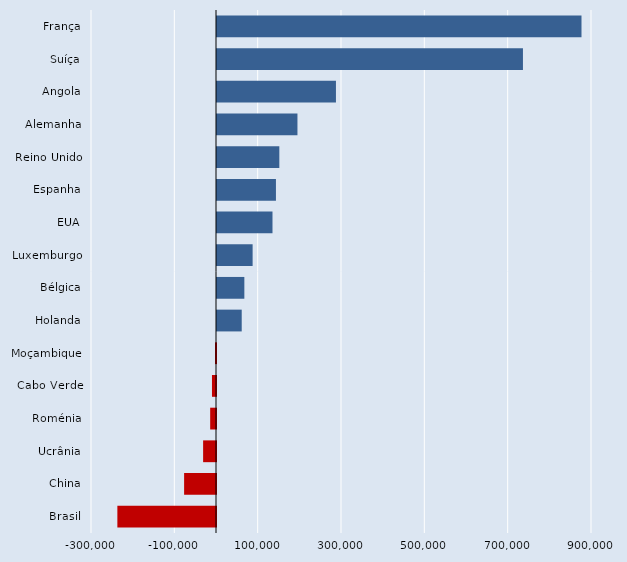
| Category | Series 0 |
|---|---|
| França | 874787 |
| Suíça | 734282 |
| Angola | 285481 |
| Alemanha | 193084 |
| Reino Unido | 149592 |
| Espanha | 141460 |
| EUA | 133181 |
| Luxemburgo | 85488 |
| Bélgica | 65639 |
| Holanda | 59320 |
| Moçambique | -2455 |
| Cabo Verde | -9692 |
| Roménia | -13975 |
| Ucrânia | -30918 |
| China | -76535 |
| Brasil | -236726 |